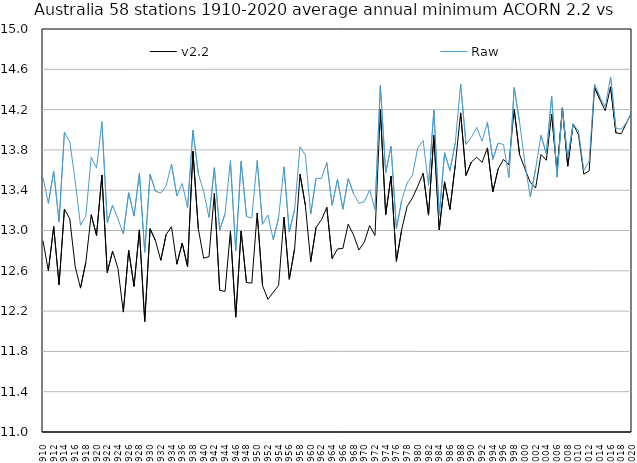
| Category | v2.2 | Raw |
|---|---|---|
| 1910 | 12.898 | 13.527 |
| 1911 | 12.599 | 13.268 |
| 1912 | 13.039 | 13.588 |
| 1913 | 12.462 | 13.084 |
| 1914 | 13.213 | 13.975 |
| 1915 | 13.116 | 13.882 |
| 1916 | 12.645 | 13.496 |
| 1917 | 12.428 | 13.052 |
| 1918 | 12.684 | 13.144 |
| 1919 | 13.157 | 13.728 |
| 1920 | 12.951 | 13.619 |
| 1921 | 13.55 | 14.08 |
| 1922 | 12.582 | 13.079 |
| 1923 | 12.796 | 13.25 |
| 1924 | 12.624 | 13.116 |
| 1925 | 12.19 | 12.965 |
| 1926 | 12.804 | 13.375 |
| 1927 | 12.446 | 13.143 |
| 1928 | 13.006 | 13.569 |
| 1929 | 12.096 | 12.784 |
| 1930 | 13.018 | 13.558 |
| 1931 | 12.9 | 13.39 |
| 1932 | 12.704 | 13.372 |
| 1933 | 12.96 | 13.443 |
| 1934 | 13.037 | 13.66 |
| 1935 | 12.665 | 13.342 |
| 1936 | 12.876 | 13.467 |
| 1937 | 12.64 | 13.226 |
| 1938 | 13.787 | 13.994 |
| 1939 | 13.019 | 13.565 |
| 1940 | 12.726 | 13.389 |
| 1941 | 12.74 | 13.129 |
| 1942 | 13.372 | 13.624 |
| 1943 | 12.406 | 13.002 |
| 1944 | 12.395 | 13.168 |
| 1945 | 12.994 | 13.694 |
| 1946 | 12.14 | 12.798 |
| 1947 | 12.995 | 13.687 |
| 1948 | 12.484 | 13.139 |
| 1949 | 12.478 | 13.124 |
| 1950 | 13.174 | 13.695 |
| 1951 | 12.453 | 13.061 |
| 1952 | 12.316 | 13.154 |
| 1953 | 12.386 | 12.91 |
| 1954 | 12.455 | 13.126 |
| 1955 | 13.133 | 13.632 |
| 1956 | 12.516 | 12.984 |
| 1957 | 12.822 | 13.211 |
| 1958 | 13.559 | 13.831 |
| 1959 | 13.25 | 13.748 |
| 1960 | 12.69 | 13.163 |
| 1961 | 13.031 | 13.519 |
| 1962 | 13.106 | 13.517 |
| 1963 | 13.23 | 13.674 |
| 1964 | 12.722 | 13.251 |
| 1965 | 12.817 | 13.508 |
| 1966 | 12.822 | 13.211 |
| 1967 | 13.063 | 13.515 |
| 1968 | 12.956 | 13.365 |
| 1969 | 12.806 | 13.269 |
| 1970 | 12.883 | 13.286 |
| 1971 | 13.049 | 13.403 |
| 1972 | 12.951 | 13.207 |
| 1973 | 14.201 | 14.438 |
| 1974 | 13.157 | 13.576 |
| 1975 | 13.541 | 13.835 |
| 1976 | 12.694 | 13.016 |
| 1977 | 13.013 | 13.302 |
| 1978 | 13.239 | 13.471 |
| 1979 | 13.323 | 13.55 |
| 1980 | 13.44 | 13.822 |
| 1981 | 13.569 | 13.893 |
| 1982 | 13.153 | 13.448 |
| 1983 | 13.945 | 14.196 |
| 1984 | 13.005 | 13.152 |
| 1985 | 13.483 | 13.773 |
| 1986 | 13.209 | 13.594 |
| 1987 | 13.653 | 13.872 |
| 1988 | 14.168 | 14.454 |
| 1989 | 13.547 | 13.855 |
| 1990 | 13.68 | 13.924 |
| 1991 | 13.727 | 14.024 |
| 1992 | 13.677 | 13.886 |
| 1993 | 13.82 | 14.075 |
| 1994 | 13.382 | 13.706 |
| 1995 | 13.611 | 13.867 |
| 1996 | 13.705 | 13.853 |
| 1997 | 13.652 | 13.527 |
| 1998 | 14.203 | 14.419 |
| 1999 | 13.754 | 14.077 |
| 2000 | 13.613 | 13.669 |
| 2001 | 13.478 | 13.332 |
| 2002 | 13.421 | 13.61 |
| 2003 | 13.755 | 13.945 |
| 2004 | 13.697 | 13.762 |
| 2005 | 14.154 | 14.331 |
| 2006 | 13.582 | 13.53 |
| 2007 | 14.217 | 14.207 |
| 2008 | 13.638 | 13.722 |
| 2009 | 14.058 | 14.054 |
| 2010 | 13.953 | 13.992 |
| 2011 | 13.559 | 13.595 |
| 2012 | 13.593 | 13.685 |
| 2013 | 14.421 | 14.453 |
| 2014 | 14.301 | 14.324 |
| 2015 | 14.188 | 14.226 |
| 2016 | 14.425 | 14.522 |
| 2017 | 13.968 | 14.011 |
| 2018 | 13.961 | 14.007 |
| 2019 | 14.071 | 14.074 |
| 2020 | 14.18 | 14.179 |